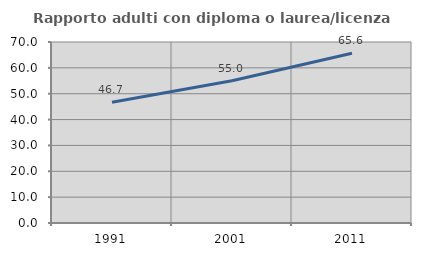
| Category | Rapporto adulti con diploma o laurea/licenza media  |
|---|---|
| 1991.0 | 46.714 |
| 2001.0 | 55.015 |
| 2011.0 | 65.649 |